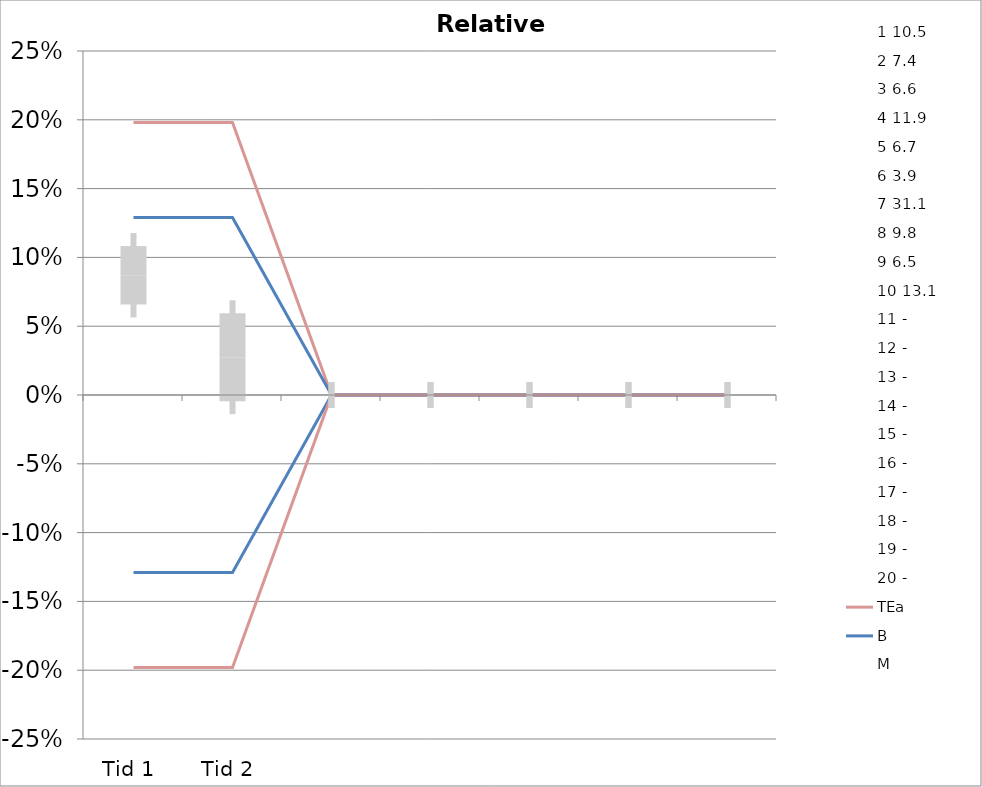
| Category | 1 | 2 | 3 | 4 | 5 | 6 | 7 | 8 | 9 | 10 | 11 | 12 | 13 | 14 | 15 | 16 | 17 | 18 | 19 | 20 | TEa | B | -B | -TEa | M |
|---|---|---|---|---|---|---|---|---|---|---|---|---|---|---|---|---|---|---|---|---|---|---|---|---|---|
| Tid 1 | 0.093 | 0.057 | 0.145 | 0.066 | 0.076 | 0.122 | 0.053 | 0.08 | 0.072 | 0.106 | 0 | 0 | 0 | 0 | 0 | 0 | 0 | 0 | 0 | 0 | 0.198 | 0.129 | -0.129 | -0.198 | 0.087 |
| Tid 2 | -0.01 | 0.043 | 0.086 | 0.026 | 0.071 | -0.031 | 0.021 | 0.037 | -0.045 | 0.075 | 0 | 0 | 0 | 0 | 0 | 0 | 0 | 0 | 0 | 0 | 0.198 | 0.129 | -0.129 | -0.198 | 0.027 |